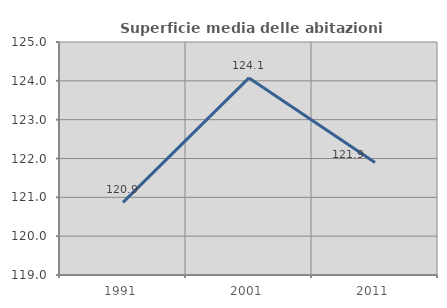
| Category | Superficie media delle abitazioni occupate |
|---|---|
| 1991.0 | 120.87 |
| 2001.0 | 124.075 |
| 2011.0 | 121.898 |